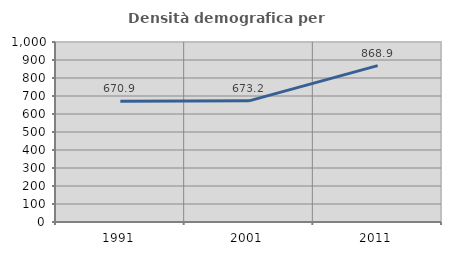
| Category | Densità demografica |
|---|---|
| 1991.0 | 670.863 |
| 2001.0 | 673.163 |
| 2011.0 | 868.903 |